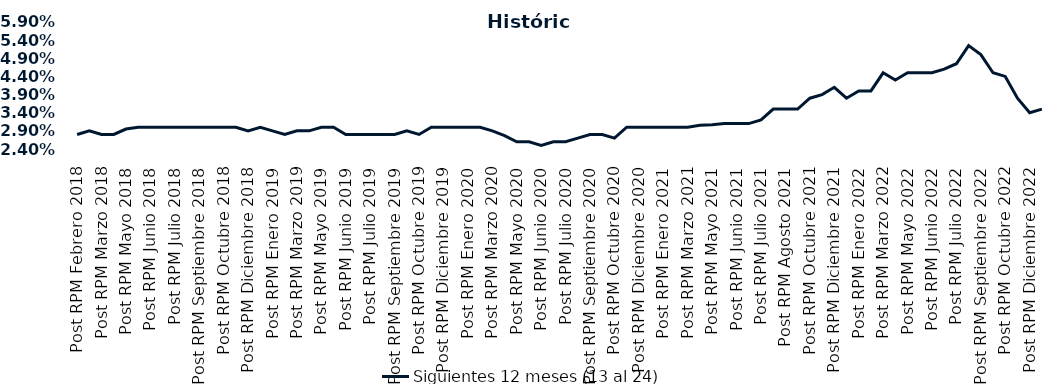
| Category | Siguientes 12 meses (13 al 24)  |
|---|---|
| Post RPM Febrero 2018 | 0.028 |
| Pre RPM Marzo 2018 | 0.029 |
| Post RPM Marzo 2018 | 0.028 |
| Pre RPM Mayo 2018 | 0.028 |
| Post RPM Mayo 2018 | 0.03 |
| Pre RPM Junio 2018 | 0.03 |
| Post RPM Junio 2018 | 0.03 |
| Pre RPM Julio 2018 | 0.03 |
| Post RPM Julio 2018 | 0.03 |
| Pre RPM Septiembre 2018 | 0.03 |
| Post RPM Septiembre 2018 | 0.03 |
| Pre RPM Octubre 2018 | 0.03 |
| Post RPM Octubre 2018 | 0.03 |
| Pre RPM Diciembre 2018 | 0.03 |
| Post RPM Diciembre 2018 | 0.029 |
| Pre RPM Enero 2019 | 0.03 |
| Post RPM Enero 2019 | 0.029 |
| Pre RPM Marzo 2019 | 0.028 |
| Post RPM Marzo 2019 | 0.029 |
| Pre RPM Mayo 2019 | 0.029 |
| Post RPM Mayo 2019 | 0.03 |
| Pre RPM Junio 2019 | 0.03 |
| Post RPM Junio 2019 | 0.028 |
| Pre RPM Julio 2019 | 0.028 |
| Post RPM Julio 2019 | 0.028 |
| Pre RPM Septiembre 2019 | 0.028 |
| Post RPM Septiembre 2019 | 0.028 |
| Pre RPM Octubre 2019 | 0.029 |
| Post RPM Octubre 2019 | 0.028 |
| Pre RPM Diciembre 2019 | 0.03 |
| Post RPM Diciembre 2019 | 0.03 |
| Pre RPM Enero 2020 | 0.03 |
| Post RPM Enero 2020 | 0.03 |
| Pre RPM Marzo 2020 | 0.03 |
| Post RPM Marzo 2020 | 0.029 |
| Pre RPM Mayo 2020 | 0.028 |
| Post RPM Mayo 2020 | 0.026 |
| Pre RPM Junio 2020 | 0.026 |
| Post RPM Junio 2020 | 0.025 |
| Pre RPM Julio 2020 | 0.026 |
| Post RPM Julio 2020 | 0.026 |
| Pre RPM Septiembre 2020 | 0.027 |
| Post RPM Septiembre 2020 | 0.028 |
| Pre RPM Octubre 2020 | 0.028 |
| Post RPM Octubre 2020 | 0.027 |
| Pre RPM Diciembre 2020 | 0.03 |
| Post RPM Diciembre 2020 | 0.03 |
| Pre RPM Enero 2021 | 0.03 |
| Post RPM Enero 2021 | 0.03 |
| Pre RPM Marzo 2021 | 0.03 |
| Post RPM Marzo 2021 | 0.03 |
| Pre RPM Mayo 2021 | 0.031 |
| Post RPM Mayo 2021 | 0.031 |
| Pre RPM Junio 2021 | 0.031 |
| Post RPM Junio 2021 | 0.031 |
| Pre RPM Julio 2021 | 0.031 |
| Post RPM Julio 2021 | 0.032 |
| Pre RPM Agosto 2021 | 0.035 |
| Post RPM Agosto 2021 | 0.035 |
| Pre RPM Octubre 2021 | 0.035 |
| Post RPM Octubre 2021 | 0.038 |
| Pre RPM Diciembre 2021 | 0.039 |
| Post RPM Diciembre 2021 | 0.041 |
| Pre RPM Enero 2022 | 0.038 |
| Post RPM Enero 2022 | 0.04 |
| Pre RPM Marzo 2022 | 0.04 |
| Post RPM Marzo 2022 | 0.045 |
| Pre RPM Mayo 2022 | 0.043 |
| Post RPM Mayo 2022 | 0.045 |
| Pre RPM Junio 2022 | 0.045 |
| Post RPM Junio 2022 | 0.045 |
| Pre RPM Julio 2022 | 0.046 |
| Post RPM Julio 2022 | 0.048 |
| Pre RPM Septiembre 2022 | 0.052 |
| Post RPM Septiembre 2022 | 0.05 |
| Pre RPM Octubre 2022 | 0.045 |
| Post RPM Octubre 2022 | 0.044 |
| Pre RPM Diciembre 2022 | 0.038 |
| Post RPM Diciembre 2022 | 0.034 |
| Pre RPM Enero 2023 | 0.035 |